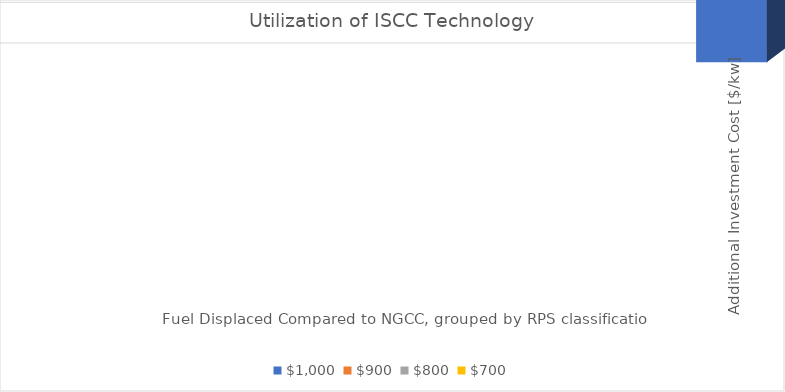
| Category | $1,000  | $900  | $800  | $700  |
|---|---|---|---|---|
| 0 | 631 | 702 | 1569 | 3138 |
| 1 | 605 | 613 | 671 | 991 |
| 2 | 603 | 604 | 606 | 620 |
| 3 | 531 | 588 | 603 | 604 |
| 4 | 0 | 0 | 817 | 2152 |
| 5 | 0 | 0 | 0 | 116 |
| 6 | 0 | 0 | 0 | 0 |
| 7 | 0 | 0 | 0 | 0 |
| 8 | 1654 | 2038 | 2300 | 3138 |
| 9 | 937 | 1335 | 1974 | 2307 |
| 10 | 0 | 396 | 876 | 1310 |
| 11 | 0 | 0 | 0 | 0 |